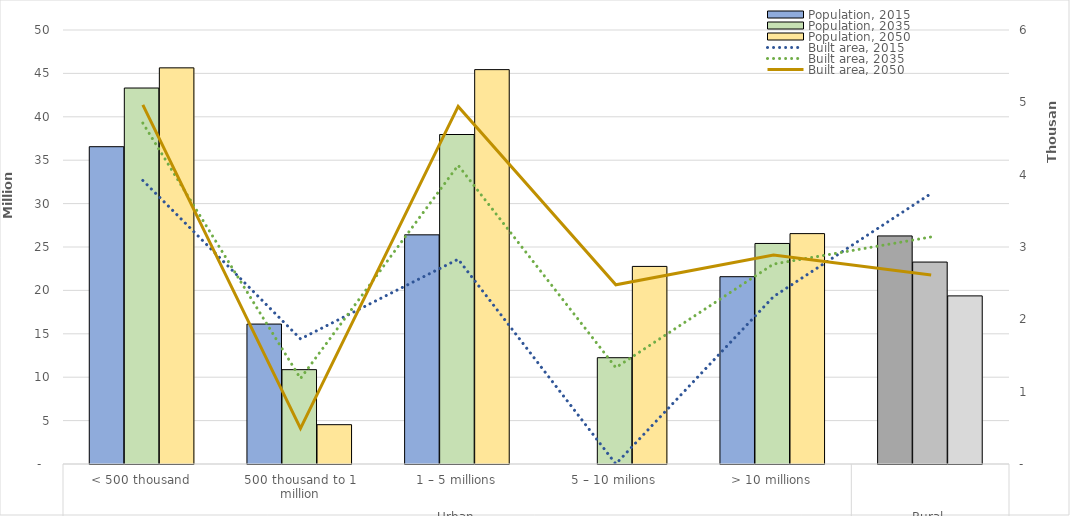
| Category | Population, 2015 | Population, 2035 | Population, 2050 |
|---|---|---|---|
| 0 | 36556582 | 43316151 | 45640076 |
| 1 | 16120437 | 10867303 | 4529180 |
| 2 | 26401976 | 37959030 | 45434727 |
| 3 | 0 | 12244848 | 22764183 |
| 4 | 21578538 | 25408061 | 26542607 |
| 5 | 26275043 | 23265212 | 19368530 |